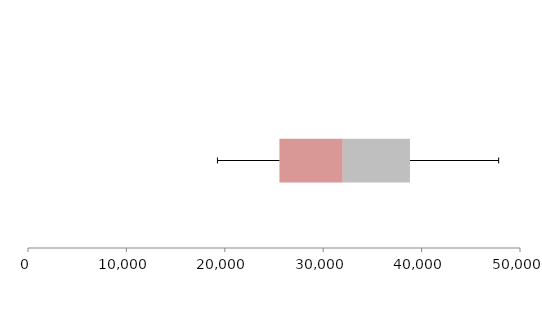
| Category | Series 1 | Series 2 | Series 3 |
|---|---|---|---|
| 0 | 25553.416 | 6434.539 | 6829.465 |